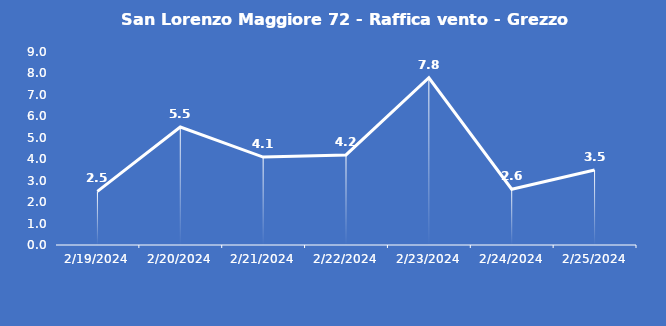
| Category | San Lorenzo Maggiore 72 - Raffica vento - Grezzo (m/s) |
|---|---|
| 2/19/24 | 2.5 |
| 2/20/24 | 5.5 |
| 2/21/24 | 4.1 |
| 2/22/24 | 4.2 |
| 2/23/24 | 7.8 |
| 2/24/24 | 2.6 |
| 2/25/24 | 3.5 |